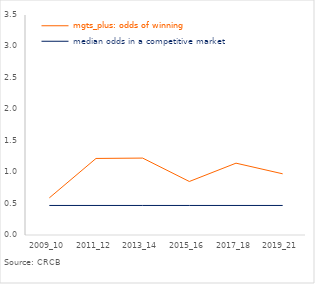
| Category | mgts_plus: odds of winning | median odds in a competitive market |
|---|---|---|
| 2009_10 | 0.591 | 0.47 |
| 2011_12 | 1.218 | 0.47 |
| 2013_14 | 1.224 | 0.47 |
| 2015_16 | 0.851 | 0.47 |
| 2017_18 | 1.143 | 0.47 |
| 2019_21 | 0.974 | 0.47 |